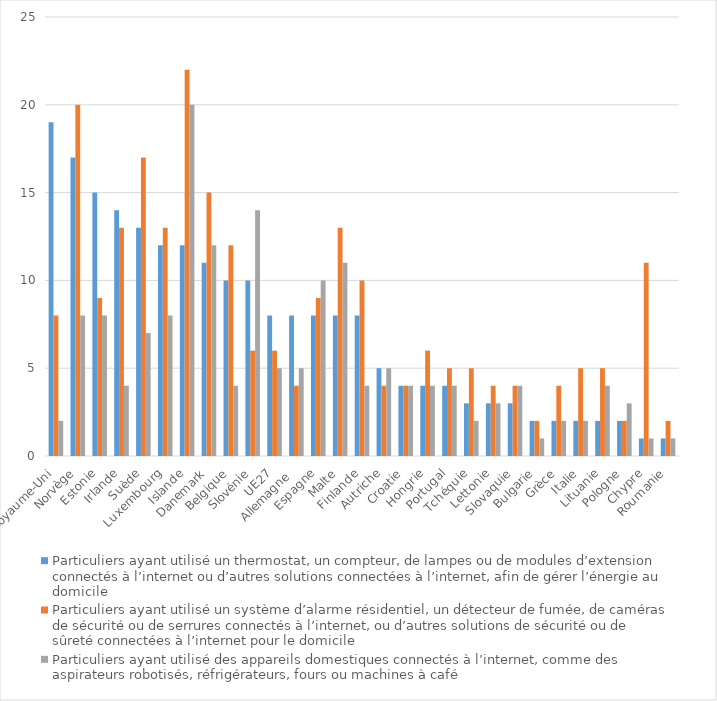
| Category | Particuliers ayant utilisé un thermostat, un compteur, de lampes ou de modules d’extension connectés à l’internet ou d’autres solutions connectées à l’internet, afin de gérer l’énergie au domicile | Particuliers ayant utilisé un système d’alarme résidentiel, un détecteur de fumée, de caméras de sécurité ou de serrures connectés à l’internet, ou d’autres solutions de sécurité ou de sûreté connectées à l’internet pour le domicile | Particuliers ayant utilisé des appareils domestiques connectés à l’internet, comme des aspirateurs robotisés, réfrigérateurs, fours ou machines à café |
|---|---|---|---|
| Royaume-Uni | 19 | 8 | 2 |
| Norvège | 17 | 20 | 8 |
| Estonie | 15 | 9 | 8 |
| Irlande | 14 | 13 | 4 |
| Suède | 13 | 17 | 7 |
| Luxembourg | 12 | 13 | 8 |
| Islande | 12 | 22 | 20 |
| Danemark | 11 | 15 | 12 |
| Belgique | 10 | 12 | 4 |
| Slovénie | 10 | 6 | 14 |
| UE27 | 8 | 6 | 5 |
| Allemagne  | 8 | 4 | 5 |
| Espagne | 8 | 9 | 10 |
| Malte | 8 | 13 | 11 |
| Finlande | 8 | 10 | 4 |
| Autriche | 5 | 4 | 5 |
| Croatie | 4 | 4 | 4 |
| Hongrie | 4 | 6 | 4 |
| Portugal | 4 | 5 | 4 |
| Tchéquie | 3 | 5 | 2 |
| Lettonie | 3 | 4 | 3 |
| Slovaquie | 3 | 4 | 4 |
| Bulgarie | 2 | 2 | 1 |
| Grèce | 2 | 4 | 2 |
| Italie | 2 | 5 | 2 |
| Lituanie | 2 | 5 | 4 |
| Pologne | 2 | 2 | 3 |
| Chypre | 1 | 11 | 1 |
| Roumanie | 1 | 2 | 1 |